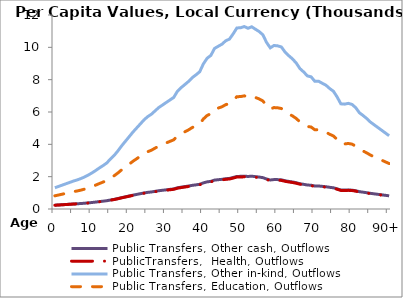
| Category | Public Transfers, Other cash, Outflows | PublicTransfers,  Health, Outflows | Public Transfers, Other in-kind, Outflows | Public Transfers, Education, Outflows |
|---|---|---|---|---|
| 0 | 236.573 | 231.934 | 1314.059 | 815.1 |
|  | 251.44 | 246.511 | 1396.642 | 866.325 |
| 2 | 266.308 | 261.087 | 1479.225 | 917.551 |
| 3 | 281.176 | 275.663 | 1561.808 | 968.776 |
| 4 | 296.043 | 290.239 | 1644.391 | 1020.002 |
| 5 | 310.911 | 304.815 | 1726.974 | 1071.228 |
| 6 | 323.611 | 317.267 | 1797.52 | 1114.987 |
| 7 | 338.981 | 332.335 | 1882.894 | 1167.944 |
| 8 | 356.693 | 349.699 | 1981.272 | 1228.966 |
| 9 | 378.33 | 370.913 | 2101.459 | 1303.518 |
| 10 | 402.078 | 394.195 | 2233.369 | 1385.34 |
| 11 | 429.034 | 420.623 | 2383.098 | 1478.216 |
| 12 | 457.423 | 448.455 | 2540.788 | 1576.03 |
| 13 | 484.064 | 474.574 | 2688.766 | 1667.819 |
| 14 | 513.213 | 503.151 | 2850.673 | 1768.249 |
| 15 | 558.599 | 547.647 | 3102.775 | 1924.626 |
| 16 | 597.941 | 586.217 | 3321.299 | 2060.174 |
| 17 | 648.233 | 635.524 | 3600.651 | 2233.454 |
| 18 | 703.942 | 690.14 | 3910.089 | 2425.396 |
| 19 | 754.637 | 739.841 | 4191.678 | 2600.063 |
| 20 | 804.686 | 788.909 | 4469.679 | 2772.505 |
| 21 | 855.632 | 838.856 | 4752.662 | 2948.037 |
| 22 | 901.096 | 883.429 | 5005.196 | 3104.682 |
| 23 | 946.734 | 928.173 | 5258.697 | 3261.926 |
| 24 | 992.579 | 973.119 | 5513.346 | 3419.882 |
| 25 | 1028.345 | 1008.183 | 5712.011 | 3543.113 |
| 26 | 1055.757 | 1035.057 | 5864.268 | 3637.557 |
| 27 | 1093.31 | 1071.874 | 6072.858 | 3766.943 |
| 28 | 1130.836 | 1108.664 | 6281.299 | 3896.238 |
| 29 | 1158.328 | 1135.618 | 6434.007 | 3990.961 |
| 30 | 1186.63 | 1163.365 | 6591.212 | 4088.474 |
| 31 | 1214.584 | 1190.77 | 6746.482 | 4184.787 |
| 32 | 1242.257 | 1217.901 | 6900.193 | 4280.133 |
| 33 | 1311.325 | 1285.615 | 7283.84 | 4518.105 |
| 34 | 1351.717 | 1325.215 | 7508.2 | 4657.274 |
| 35 | 1385.929 | 1358.756 | 7698.231 | 4775.149 |
| 36 | 1420.807 | 1392.951 | 7891.965 | 4895.32 |
| 37 | 1463.048 | 1434.363 | 8126.593 | 5040.858 |
| 38 | 1493.946 | 1464.656 | 8298.221 | 5147.317 |
| 39 | 1528.511 | 1498.542 | 8490.21 | 5266.406 |
| 40 | 1617.465 | 1585.753 | 8984.315 | 5572.896 |
| 41 | 1678.866 | 1645.95 | 9325.369 | 5784.449 |
| 42 | 1710.513 | 1676.976 | 9501.154 | 5893.487 |
| 43 | 1788.31 | 1753.248 | 9933.282 | 6161.532 |
| 44 | 1812.294 | 1776.762 | 10066.503 | 6244.168 |
| 45 | 1835.681 | 1799.69 | 10196.406 | 6324.746 |
| 46 | 1873.241 | 1836.514 | 10405.039 | 6454.159 |
| 47 | 1892.04 | 1854.945 | 10509.459 | 6518.93 |
| 48 | 1949.807 | 1911.578 | 10830.326 | 6717.961 |
| 49 | 2016.042 | 1976.515 | 11198.233 | 6946.171 |
| 50 | 2018.54 | 1978.964 | 11212.108 | 6954.778 |
| 51 | 2031.621 | 1991.789 | 11284.77 | 6999.849 |
| 52 | 2012.512 | 1973.054 | 11178.628 | 6934.01 |
| 53 | 2029.197 | 1989.413 | 11271.307 | 6991.498 |
| 54 | 2002.181 | 1962.926 | 11121.242 | 6898.414 |
| 55 | 1976.033 | 1937.291 | 10976.003 | 6808.324 |
| 56 | 1939.936 | 1901.901 | 10775.498 | 6683.952 |
| 57 | 1854.691 | 1818.328 | 10302.002 | 6390.246 |
| 58 | 1794.609 | 1759.424 | 9968.271 | 6183.236 |
| 59 | 1820.681 | 1784.984 | 10113.09 | 6273.066 |
| 60 | 1816.955 | 1781.332 | 10092.394 | 6260.228 |
| 61 | 1803.681 | 1768.318 | 10018.663 | 6214.494 |
| 62 | 1746.396 | 1712.156 | 9700.47 | 6017.121 |
| 63 | 1706.183 | 1672.731 | 9477.102 | 5878.568 |
| 64 | 1670.581 | 1637.827 | 9279.35 | 5755.904 |
| 65 | 1624.289 | 1592.442 | 9022.215 | 5596.405 |
| 66 | 1562.85 | 1532.208 | 8680.95 | 5384.721 |
| 67 | 1525.568 | 1495.657 | 8473.864 | 5256.268 |
| 68 | 1482.11 | 1453.052 | 8232.477 | 5106.537 |
| 69 | 1471.52 | 1442.669 | 8173.654 | 5070.049 |
| 70 | 1421.957 | 1394.078 | 7898.352 | 4899.282 |
| 71 | 1422.983 | 1395.084 | 7904.05 | 4902.816 |
| 72 | 1399.929 | 1372.481 | 7775.993 | 4823.384 |
| 73 | 1378.096 | 1351.077 | 7654.724 | 4748.162 |
| 74 | 1341.399 | 1315.099 | 7450.887 | 4621.724 |
| 75 | 1311.301 | 1285.592 | 7283.707 | 4518.023 |
| 76 | 1247.277 | 1222.822 | 6928.079 | 4297.43 |
| 77 | 1171.137 | 1148.175 | 6505.154 | 4035.093 |
| 78 | 1167.699 | 1144.805 | 6486.061 | 4023.249 |
| 79 | 1176.391 | 1153.326 | 6534.339 | 4053.196 |
| 80 | 1164.824 | 1141.986 | 6470.091 | 4013.343 |
| 81 | 1128.192 | 1106.072 | 6266.613 | 3887.128 |
| 82 | 1071.356 | 1050.35 | 5950.913 | 3691.302 |
| 83 | 1040.455 | 1020.056 | 5779.275 | 3584.837 |
| 84 | 1006.141 | 986.414 | 5588.673 | 3466.607 |
| 85 | 966.84 | 947.883 | 5370.372 | 3331.197 |
| 86 | 936.673 | 918.309 | 5202.811 | 3227.261 |
| 87 | 906.499 | 888.726 | 5035.205 | 3123.296 |
| 88 | 876.324 | 859.143 | 4867.598 | 3019.33 |
| 89 | 846.149 | 829.56 | 4699.991 | 2915.365 |
| 90+ | 815.975 | 799.977 | 4532.384 | 2811.4 |